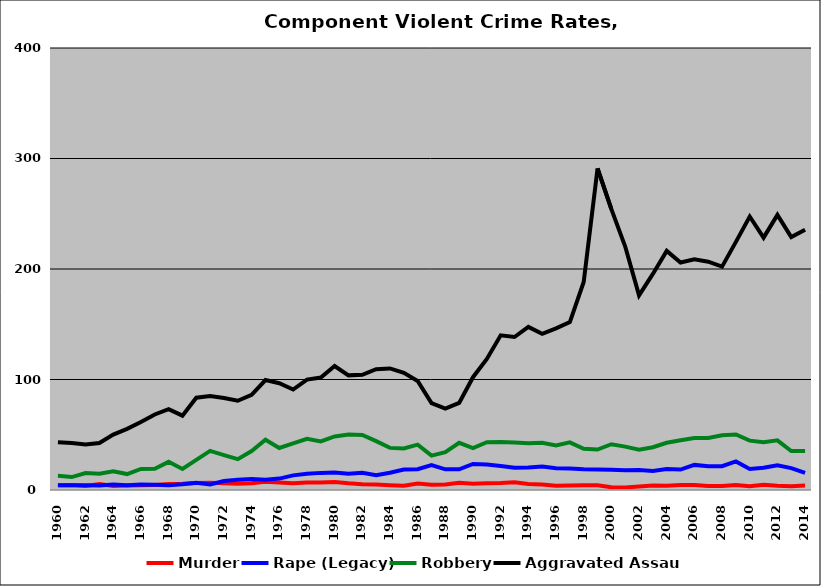
| Category | Murder | Rape (Legacy) | Robbery | Aggravated Assault |
|---|---|---|---|---|
| 1960.0 | 4.354 | 4.193 | 12.793 | 43.162 |
| 1961.0 | 4.432 | 4.378 | 11.676 | 42.595 |
| 1962.0 | 3.723 | 4.23 | 15.398 | 41.286 |
| 1963.0 | 5.343 | 4.162 | 14.623 | 42.52 |
| 1964.0 | 3.728 | 4.953 | 16.861 | 50.083 |
| 1965.0 | 3.974 | 4.249 | 14.404 | 55.353 |
| 1966.0 | 4.236 | 5.072 | 19.064 | 61.538 |
| 1967.0 | 4.616 | 4.727 | 19.299 | 68.354 |
| 1968.0 | 5.485 | 4.377 | 25.485 | 73.186 |
| 1969.0 | 5.607 | 5.113 | 19.076 | 67.29 |
| 1970.0 | 6.249 | 6.65 | 27.29 | 83.532 |
| 1971.0 | 6.45 | 4.966 | 35.388 | 85.103 |
| 1972.0 | 6.12 | 8.198 | 31.555 | 83.212 |
| 1973.0 | 5.741 | 9.253 | 27.926 | 80.769 |
| 1974.0 | 6.03 | 9.994 | 35.232 | 86.097 |
| 1975.0 | 7.377 | 9.318 | 45.48 | 99.501 |
| 1976.0 | 6.7 | 10.324 | 38.001 | 96.595 |
| 1977.0 | 6.025 | 13.233 | 42.173 | 90.909 |
| 1978.0 | 6.828 | 14.677 | 46.344 | 99.892 |
| 1979.0 | 6.816 | 15.495 | 43.93 | 101.81 |
| 1980.0 | 7.147 | 15.848 | 48.478 | 112.234 |
| 1981.0 | 6.048 | 14.813 | 50.179 | 103.742 |
| 1982.0 | 5.236 | 15.503 | 49.795 | 104.261 |
| 1983.0 | 4.885 | 13.384 | 44.224 | 109.262 |
| 1984.0 | 4.406 | 15.625 | 38.115 | 110.041 |
| 1985.0 | 3.771 | 18.543 | 37.603 | 106.095 |
| 1986.0 | 5.941 | 18.864 | 41.011 | 98.645 |
| 1987.0 | 4.85 | 22.615 | 31.154 | 78.703 |
| 1988.0 | 4.936 | 18.737 | 34.183 | 73.567 |
| 1989.0 | 6.516 | 18.686 | 42.703 | 78.783 |
| 1990.0 | 5.687 | 23.585 | 37.915 | 102.092 |
| 1991.0 | 6.163 | 23.043 | 43.254 | 118.545 |
| 1992.0 | 6.347 | 21.689 | 43.488 | 140.011 |
| 1993.0 | 6.923 | 20.055 | 42.967 | 138.462 |
| 1994.0 | 5.434 | 20.307 | 42.371 | 147.64 |
| 1995.0 | 4.869 | 21.225 | 42.724 | 141.357 |
| 1996.0 | 3.779 | 19.606 | 40.361 | 146.331 |
| 1997.0 | 4.13 | 19.548 | 43.062 | 151.927 |
| 1998.0 | 4.307 | 18.719 | 37.327 | 188.294 |
| 1999.0 | 4.372 | 18.65 | 36.581 | 291.046 |
| 2000.0 | 2.544 | 18.304 | 41.419 | 254.21 |
| 2001.0 | 2.221 | 17.768 | 39.257 | 220.325 |
| 2002.0 | 3.158 | 18.173 | 36.401 | 176.133 |
| 2003.0 | 4.03 | 17.169 | 38.698 | 195.535 |
| 2004.0 | 3.752 | 19.089 | 42.702 | 216.38 |
| 2005.0 | 4.52 | 18.467 | 44.981 | 205.889 |
| 2006.0 | 4.509 | 22.711 | 47.128 | 208.747 |
| 2007.0 | 3.642 | 21.523 | 47.129 | 206.619 |
| 2008.0 | 3.692 | 21.599 | 49.535 | 202.163 |
| 2009.0 | 4.616 | 25.827 | 50.226 | 224.533 |
| 2010.0 | 3.346 | 19.104 | 44.684 | 247.491 |
| 2011.0 | 4.69 | 20.055 | 43.237 | 228.367 |
| 2012.0 | 3.77 | 22.352 | 44.973 | 248.993 |
| 2013.0 | 3.345 | 19.799 | 35.229 | 228.853 |
| 2014.0 | 3.999 | 15.403 | 35.183 | 235.526 |